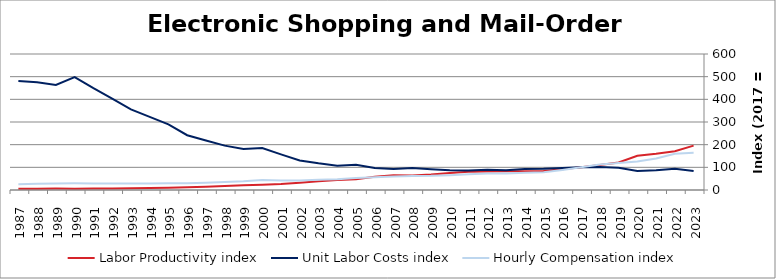
| Category | Labor Productivity index | Unit Labor Costs index | Hourly Compensation index |
|---|---|---|---|
| 2023.0 | 195.712 | 83.775 | 163.958 |
| 2022.0 | 171.378 | 93.3 | 159.896 |
| 2021.0 | 159.788 | 86.91 | 138.871 |
| 2020.0 | 151.161 | 83.442 | 126.132 |
| 2019.0 | 121.248 | 98.068 | 118.906 |
| 2018.0 | 110.803 | 101.127 | 112.052 |
| 2017.0 | 100 | 100 | 100 |
| 2016.0 | 91.36 | 96.532 | 88.192 |
| 2015.0 | 83.637 | 93.477 | 78.182 |
| 2014.0 | 82.447 | 92.845 | 76.548 |
| 2013.0 | 82.838 | 87.483 | 72.469 |
| 2012.0 | 82.098 | 89.236 | 73.261 |
| 2011.0 | 80.245 | 86.227 | 69.192 |
| 2010.0 | 74.677 | 87.289 | 65.185 |
| 2009.0 | 68.3 | 91.728 | 62.65 |
| 2008.0 | 64.123 | 96.871 | 62.117 |
| 2007.0 | 64.924 | 92.216 | 59.87 |
| 2006.0 | 58.345 | 97.13 | 56.671 |
| 2005.0 | 47.272 | 111.181 | 52.557 |
| 2004.0 | 44.415 | 107.527 | 47.758 |
| 2003.0 | 38.619 | 118.037 | 45.585 |
| 2002.0 | 32.254 | 130.573 | 42.115 |
| 2001.0 | 26.755 | 157.204 | 42.061 |
| 2000.0 | 23.591 | 185.086 | 43.663 |
| 1999.0 | 21.093 | 181.436 | 38.271 |
| 1998.0 | 17.839 | 195.837 | 34.936 |
| 1997.0 | 14.579 | 218.652 | 31.878 |
| 1996.0 | 12.378 | 241.666 | 29.913 |
| 1995.0 | 10.396 | 289.571 | 30.104 |
| 1994.0 | 8.91 | 322.891 | 28.771 |
| 1993.0 | 8.157 | 355.682 | 29.013 |
| 1992.0 | 7.021 | 403.495 | 28.328 |
| 1991.0 | 6.492 | 449.385 | 29.172 |
| 1990.0 | 5.922 | 498.081 | 29.495 |
| 1989.0 | 6.195 | 463.385 | 28.707 |
| 1988.0 | 5.814 | 474.901 | 27.61 |
| 1987.0 | 5.295 | 480.982 | 25.466 |